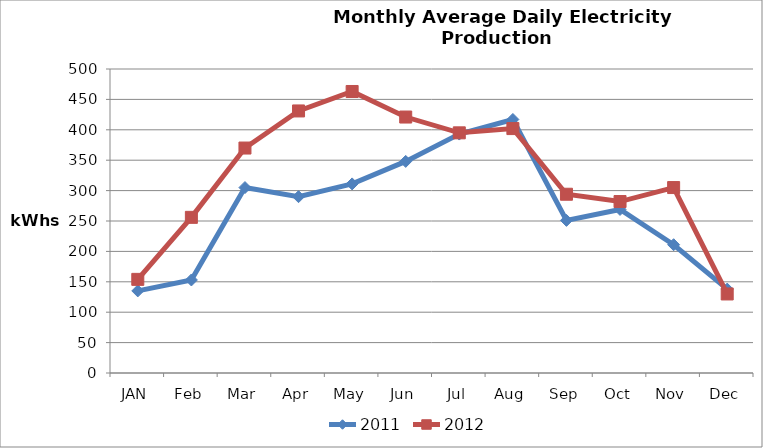
| Category | 2011 | 2012 |
|---|---|---|
| JAN | 135 | 154 |
| Feb | 153 | 256 |
| Mar | 305 | 370 |
| Apr | 290 | 431 |
| May | 311 | 463 |
| Jun | 348 | 421 |
| Jul | 393 | 395 |
| Aug | 417 | 402 |
| Sep | 251 | 294 |
| Oct | 269 | 282 |
| Nov | 211 | 305 |
| Dec | 138 | 130 |